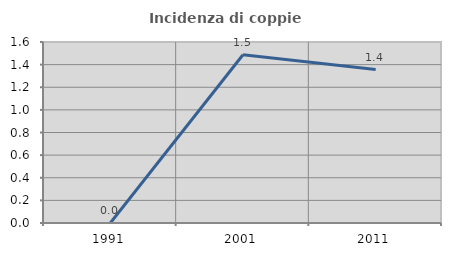
| Category | Incidenza di coppie miste |
|---|---|
| 1991.0 | 0 |
| 2001.0 | 1.487 |
| 2011.0 | 1.356 |